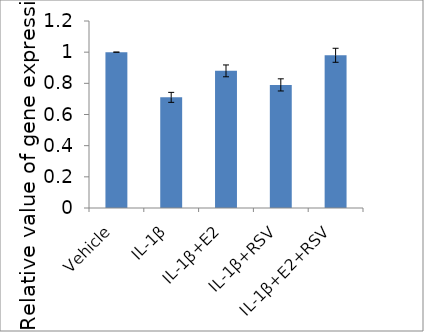
| Category | Series 0 |
|---|---|
| Vehicle | 1 |
| IL-1β | 0.71 |
| IL-1β+E2 | 0.88 |
| IL-1β+RSV | 0.79 |
| IL-1β+E2+RSV | 0.98 |